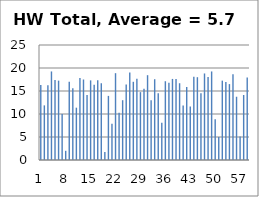
| Category | Series 0 |
|---|---|
| 0 | 16.312 |
| 1 | 11.875 |
| 2 | 16.25 |
| 3 | 19.25 |
| 4 | 17.375 |
| 5 | 17.25 |
| 6 | 10 |
| 7 | 2 |
| 8 | 17 |
| 9 | 15.625 |
| 10 | 11.375 |
| 11 | 17.812 |
| 12 | 17.5 |
| 13 | 14.125 |
| 14 | 17.312 |
| 15 | 16.375 |
| 16 | 17.312 |
| 17 | 16.688 |
| 18 | 1.75 |
| 19 | 13.938 |
| 20 | 7.875 |
| 21 | 18.875 |
| 22 | 10.25 |
| 23 | 13 |
| 24 | 16.438 |
| 25 | 19 |
| 26 | 17 |
| 27 | 17.688 |
| 28 | 14.75 |
| 29 | 15.5 |
| 30 | 18.438 |
| 31 | 13 |
| 32 | 17.562 |
| 33 | 14.5 |
| 34 | 8.125 |
| 35 | 17.125 |
| 36 | 16.812 |
| 37 | 17.625 |
| 38 | 17.625 |
| 39 | 16.688 |
| 40 | 11.875 |
| 41 | 15.875 |
| 42 | 11.625 |
| 43 | 18.125 |
| 44 | 18 |
| 45 | 14.5 |
| 46 | 18.812 |
| 47 | 18.062 |
| 48 | 19.25 |
| 49 | 8.875 |
| 50 | 5 |
| 51 | 17.25 |
| 52 | 16.938 |
| 53 | 16.5 |
| 54 | 18.625 |
| 55 | 13.75 |
| 56 | 5.125 |
| 57 | 14.125 |
| 58 | 17.938 |